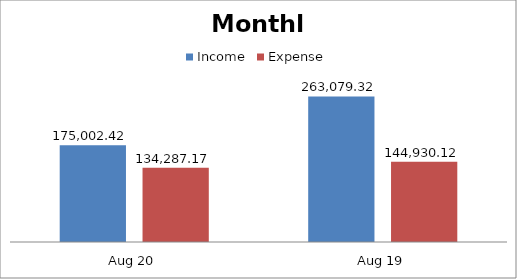
| Category | Income | Expense |
|---|---|---|
| Aug 20 | 175002.42 | 134287.17 |
| Aug 19 | 263079.32 | 144930.12 |